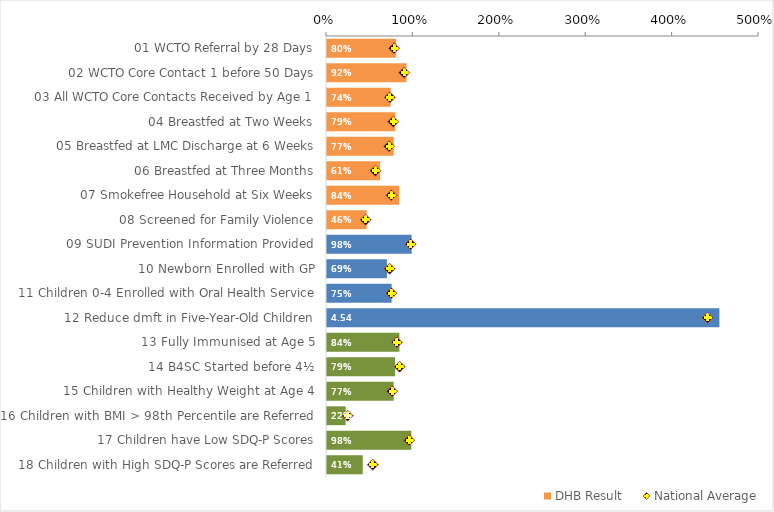
| Category | DHB Result |
|---|---|
| 01 WCTO Referral by 28 Days | 0.8 |
| 02 WCTO Core Contact 1 before 50 Days | 0.921 |
| 03 All WCTO Core Contacts Received by Age 1 | 0.736 |
| 04 Breastfed at Two Weeks | 0.791 |
| 05 Breastfed at LMC Discharge at 6 Weeks | 0.772 |
| 06 Breastfed at Three Months | 0.615 |
| 07 Smokefree Household at Six Weeks | 0.835 |
| 08 Screened for Family Violence | 0.458 |
| 09 SUDI Prevention Information Provided | 0.979 |
| 10 Newborn Enrolled with GP | 0.694 |
| 11 Children 0-4 Enrolled with Oral Health Service | 0.748 |
| 12 Reduce dmft in Five-Year-Old Children | 4.541 |
| 13 Fully Immunised at Age 5 | 0.838 |
| 14 B4SC Started before 4½ | 0.788 |
| 15 Children with Healthy Weight at Age 4 | 0.772 |
| 16 Children with BMI > 98th Percentile are Referred | 0.216 |
| 17 Children have Low SDQ-P Scores | 0.976 |
| 18 Children with High SDQ-P Scores are Referred | 0.414 |